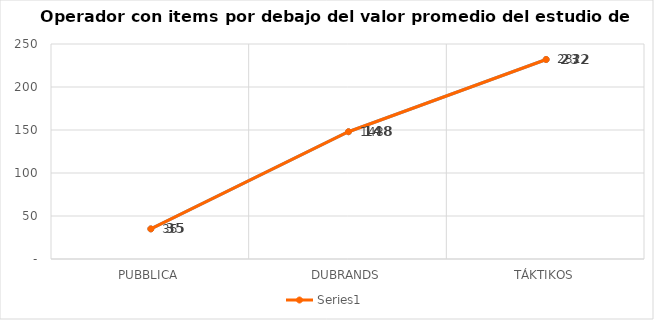
| Category | Series 1 | Series 0 |
|---|---|---|
| PUBBLICA | 35 | 35 |
| DUBRANDS | 148 | 148 |
| TÁKTIKOS | 232 | 232 |